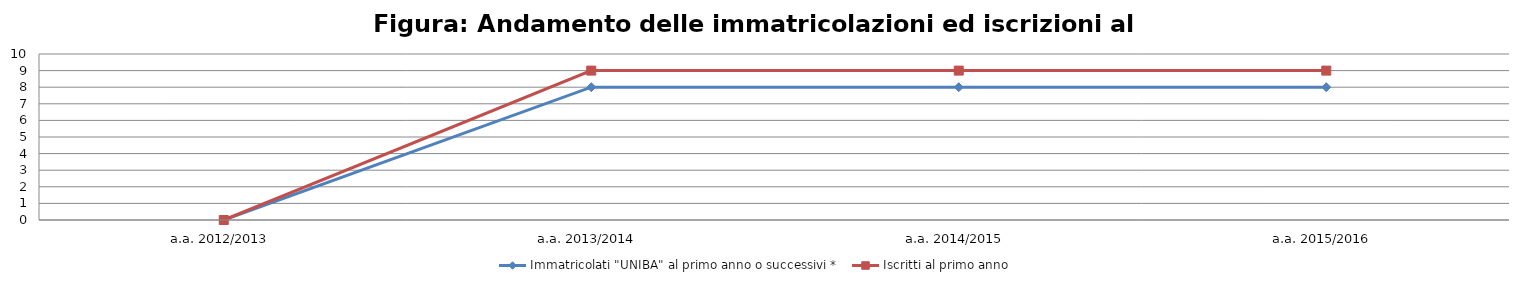
| Category | Immatricolati "UNIBA" al primo anno o successivi * | Iscritti al primo anno  |
|---|---|---|
| a.a. 2012/2013 | 0 | 0 |
| a.a. 2013/2014 | 8 | 9 |
| a.a. 2014/2015 | 8 | 9 |
| a.a. 2015/2016 | 8 | 9 |